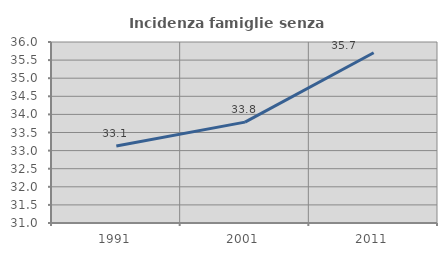
| Category | Incidenza famiglie senza nuclei |
|---|---|
| 1991.0 | 33.129 |
| 2001.0 | 33.786 |
| 2011.0 | 35.702 |